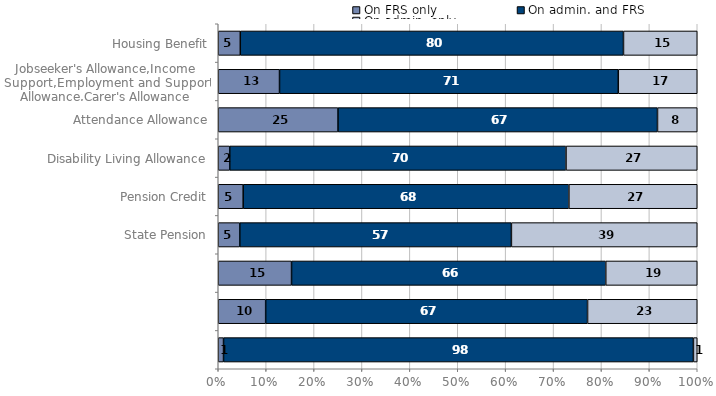
| Category | On FRS only | On admin. and FRS | On admin. only |
|---|---|---|---|
| 0 | 4.6 | 80 | 15.4 |
| 1 | 12.8 | 70.8 | 16.5 |
| 2 | 25 | 66.7 | 8.3 |
| 3 | 2.4 | 70.2 | 27.4 |
| 4 | 5.2 | 68 | 26.8 |
| 5 | 4.5 | 56.7 | 38.8 |
| 6 | 15.3 | 65.6 | 19.1 |
| 7 | 9.9 | 67.2 | 22.9 |
| 8 | 1.1 | 98.1 | 0.8 |